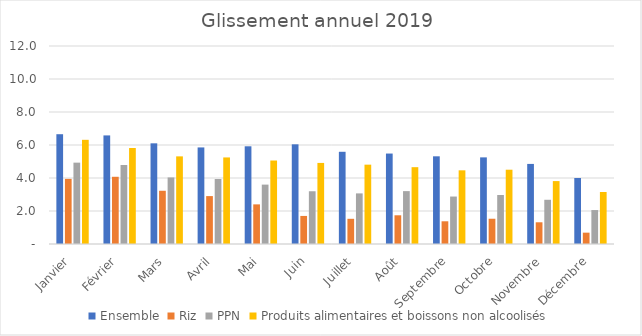
| Category |  Ensemble  |  Riz  |  PPN  |  Produits alimentaires et boissons non alcoolisés  |
|---|---|---|---|---|
| Janvier | 6.654 | 3.947 | 4.931 | 6.314 |
| Février | 6.581 | 4.074 | 4.789 | 5.817 |
| Mars | 6.102 | 3.226 | 4.034 | 5.311 |
| Avril | 5.853 | 2.903 | 3.939 | 5.246 |
| Mai | 5.922 | 2.402 | 3.599 | 5.06 |
| Juin | 6.041 | 1.701 | 3.197 | 4.914 |
| Juillet | 5.589 | 1.527 | 3.067 | 4.809 |
| Août | 5.482 | 1.74 | 3.205 | 4.656 |
| Septembre | 5.314 | 1.377 | 2.876 | 4.465 |
| Octobre | 5.25 | 1.531 | 2.969 | 4.503 |
| Novembre | 4.853 | 1.316 | 2.68 | 3.813 |
| Décembre | 4.001 | 0.687 | 2.057 | 3.15 |